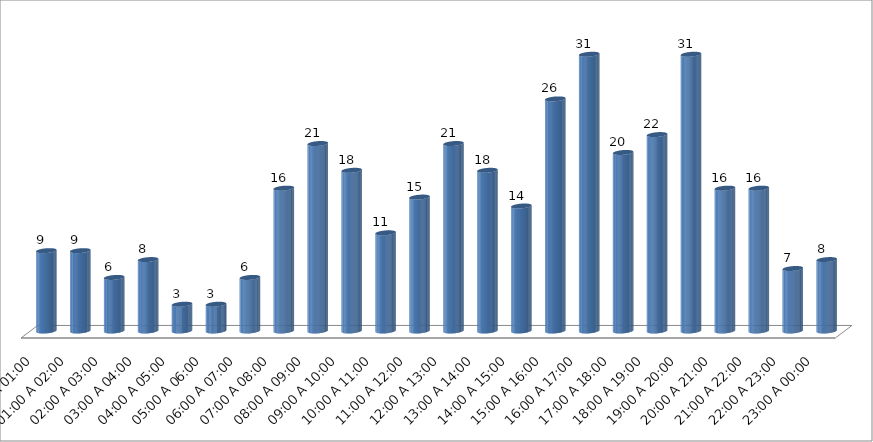
| Category | COMPUTO |
|---|---|
| 00:00 A 01:00 | 9 |
| 01:00 A 02:00 | 9 |
| 02:00 A 03:00 | 6 |
| 03:00 A 04:00 | 8 |
| 04:00 A 05:00 | 3 |
| 05:00 A 06:00 | 3 |
| 06:00 A 07:00 | 6 |
| 07:00 A 08:00 | 16 |
| 08:00 A 09:00 | 21 |
| 09:00 A 10:00 | 18 |
| 10:00 A 11:00 | 11 |
| 11:00 A 12:00 | 15 |
| 12:00 A 13:00 | 21 |
| 13:00 A 14:00 | 18 |
| 14:00 A 15:00 | 14 |
| 15:00 A 16:00 | 26 |
| 16:00 A 17:00 | 31 |
| 17:00 A 18:00 | 20 |
| 18:00 A 19:00 | 22 |
| 19:00 A 20:00 | 31 |
| 20:00 A 21:00 | 16 |
| 21:00 A 22:00 | 16 |
| 22:00 A 23:00 | 7 |
| 23:00 A 00:00 | 8 |